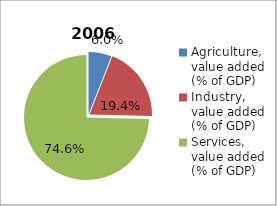
| Category | 2006 |
|---|---|
| Agriculture, value added (% of GDP)  | 5.952 |
| Industry, value added (% of GDP) | 19.443 |
| Services, value added (% of GDP) | 74.604 |